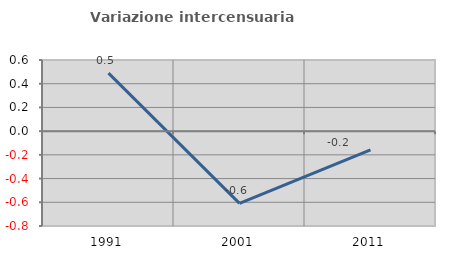
| Category | Variazione intercensuaria annua |
|---|---|
| 1991.0 | 0.49 |
| 2001.0 | -0.609 |
| 2011.0 | -0.157 |